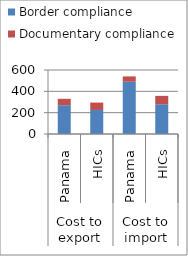
| Category | Border compliance | Documentary compliance |
|---|---|---|
| 0 | 270 | 60 |
| 1 | 225.378 | 69.207 |
| 2 | 490 | 50 |
| 3 | 279.055 | 78.483 |